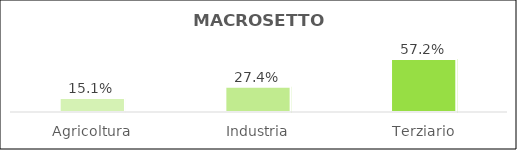
| Category | Series 0 |
|---|---|
| Agricoltura | 0.151 |
| Industria | 0.274 |
| Terziario | 0.572 |